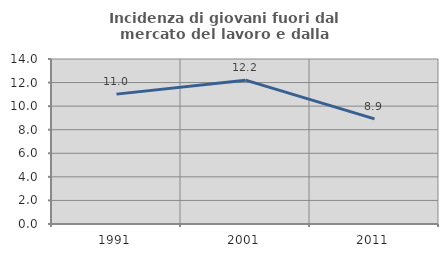
| Category | Incidenza di giovani fuori dal mercato del lavoro e dalla formazione  |
|---|---|
| 1991.0 | 11.02 |
| 2001.0 | 12.207 |
| 2011.0 | 8.917 |